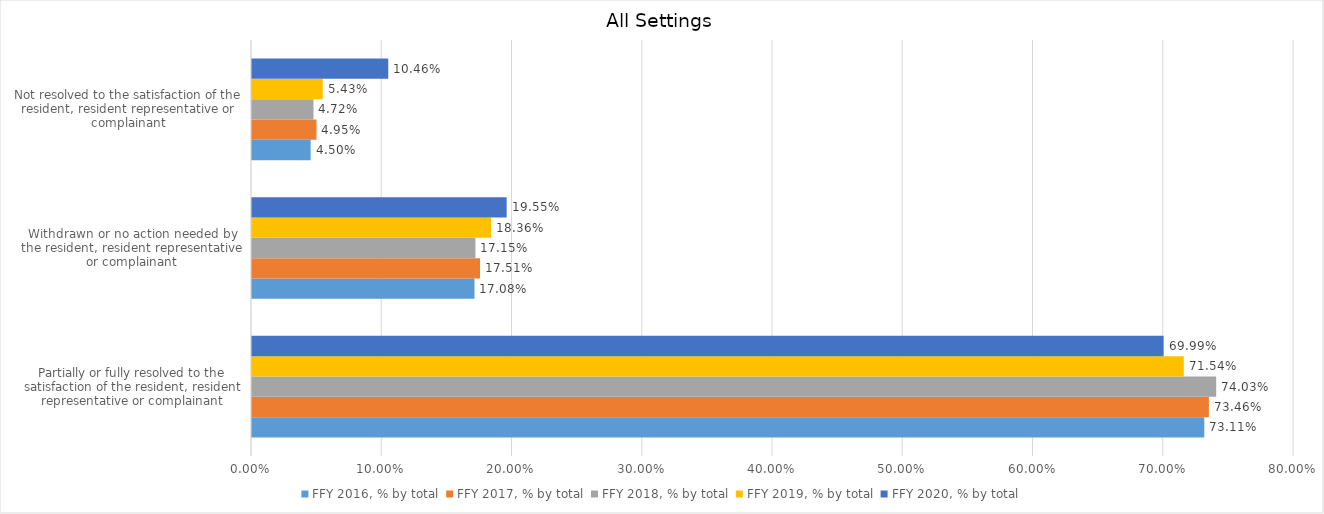
| Category | FFY 2016, % by total | FFY 2017, % by total | FFY 2018, % by total | FFY 2019, % by total | FFY 2020, % by total |
|---|---|---|---|---|---|
| Partially or fully resolved to the satisfaction of the resident, resident representative or complainant | 0.731 | 0.735 | 0.74 | 0.715 | 0.7 |
| Withdrawn or no action needed by the resident, resident representative or complainant | 0.171 | 0.175 | 0.172 | 0.184 | 0.196 |
| Not resolved to the satisfaction of the resident, resident representative or complainant | 0.045 | 0.05 | 0.047 | 0.054 | 0.105 |